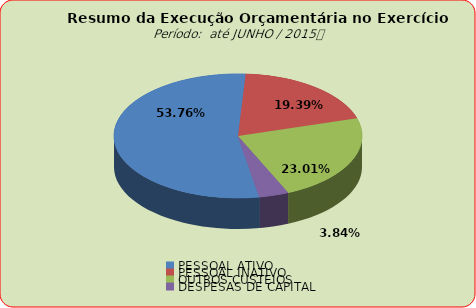
| Category | Series 0 |
|---|---|
| PESSOAL ATIVO | 61806079.19 |
| PESSOAL INATIVO | 22296850.33 |
| OUTROS CUSTEIOS | 26450149.11 |
| DESPESAS DE CAPITAL | 4414884.09 |